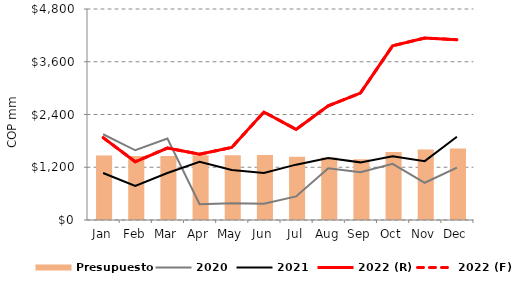
| Category | Presupuesto |
|---|---|
| 2022-01-31 | 1469.706 |
| 2022-02-28 | 1455.208 |
| 2022-03-31 | 1453.174 |
| 2022-04-30 | 1473.887 |
| 2022-05-31 | 1475.409 |
| 2022-06-30 | 1477.437 |
| 2022-07-31 | 1439.713 |
| 2022-08-31 | 1421.312 |
| 2022-09-30 | 1382.983 |
| 2022-10-31 | 1544.328 |
| 2022-11-30 | 1603.696 |
| 2022-12-31 | 1628.686 |